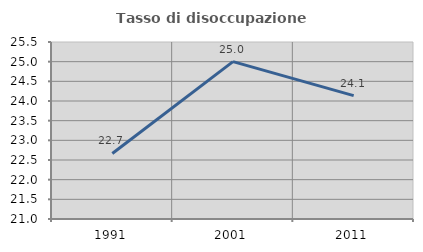
| Category | Tasso di disoccupazione giovanile  |
|---|---|
| 1991.0 | 22.667 |
| 2001.0 | 25 |
| 2011.0 | 24.138 |